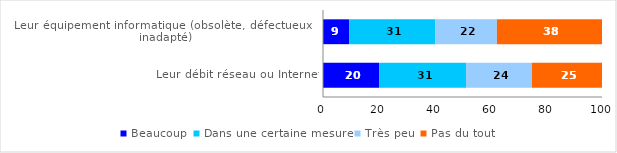
| Category | Beaucoup | Dans une certaine mesure | Très peu | Pas du tout |
|---|---|---|---|---|
| Leur débit réseau ou Internet | 20.104 | 31.175 | 23.619 | 25.101 |
| Leur équipement informatique (obsolète, défectueux ou inadapté) | 9.365 | 30.95 | 22.008 | 37.678 |